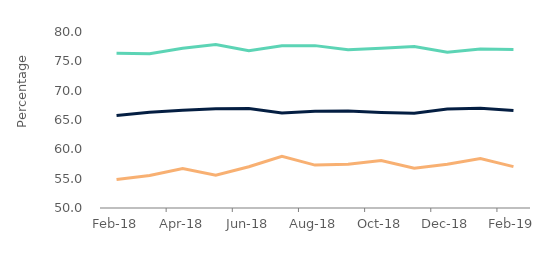
| Category | First-time
buyers | Homemovers | Remortgagers |
|---|---|---|---|
| 2018-02-01 | 76.366 | 65.758 | 54.847 |
| 2018-03-01 | 76.276 | 66.327 | 55.557 |
| 2018-04-01 | 77.221 | 66.651 | 56.744 |
| 2018-05-01 | 77.862 | 66.936 | 55.608 |
| 2018-06-01 | 76.799 | 66.951 | 57.029 |
| 2018-07-01 | 77.641 | 66.174 | 58.827 |
| 2018-08-01 | 77.676 | 66.491 | 57.31 |
| 2018-09-01 | 76.996 | 66.513 | 57.46 |
| 2018-10-01 | 77.234 | 66.268 | 58.095 |
| 2018-11-01 | 77.534 | 66.144 | 56.766 |
| 2018-12-01 | 76.548 | 66.859 | 57.473 |
| 2019-01-01 | 77.095 | 66.991 | 58.449 |
| 2019-02-01 | 77.03 | 66.607 | 57.053 |